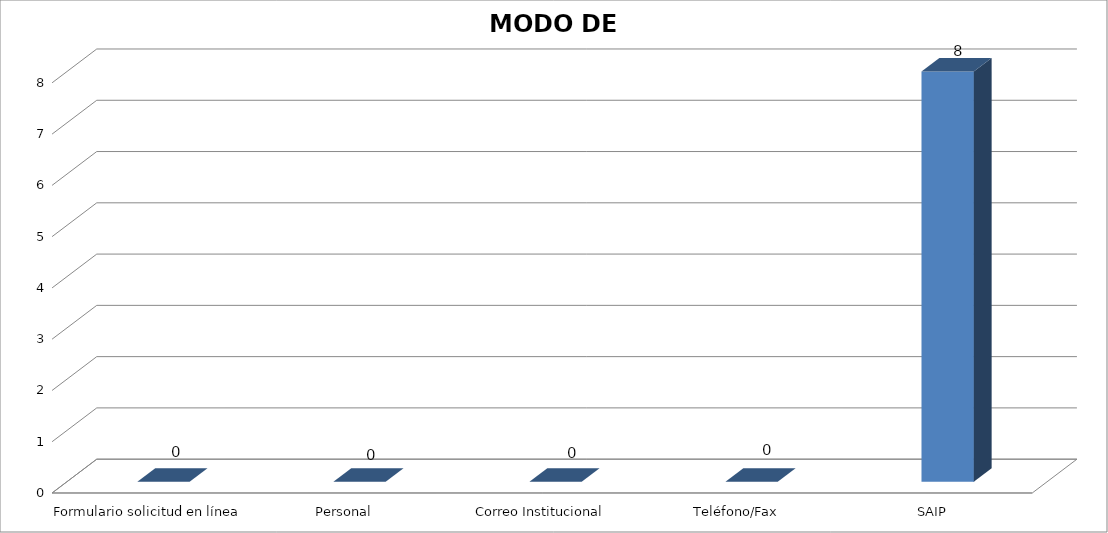
| Category | Series 0 | Series 1 | Series 2 |
|---|---|---|---|
| Formulario solicitud en línea |  | 0 |  |
| Personal |  | 0 |  |
| Correo Institucional |  | 0 |  |
| Teléfono/Fax |  | 0 |  |
| SAIP |  | 8 |  |